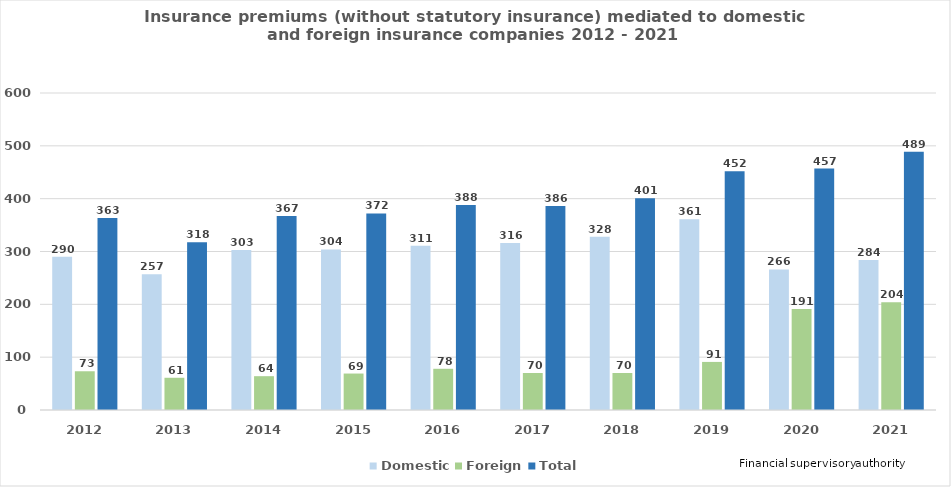
| Category | Domestic | Foreign | Total |
|---|---|---|---|
| 2012.0 | 289.922 | 73.321 | 363.243 |
| 2013.0 | 257 | 61 | 317.523 |
| 2014.0 | 303 | 64 | 367 |
| 2015.0 | 304 | 69 | 372 |
| 2016.0 | 311 | 78 | 388 |
| 2017.0 | 316 | 70 | 386 |
| 2018.0 | 328 | 70 | 401 |
| 2019.0 | 361 | 91 | 452 |
| 2020.0 | 266 | 191 | 457 |
| 2021.0 | 284 | 204 | 489 |